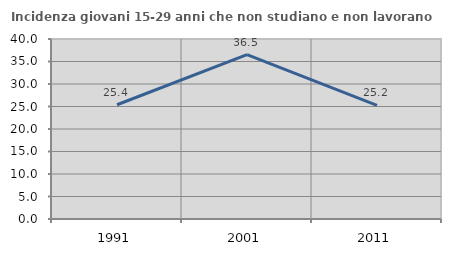
| Category | Incidenza giovani 15-29 anni che non studiano e non lavorano  |
|---|---|
| 1991.0 | 25.385 |
| 2001.0 | 36.534 |
| 2011.0 | 25.241 |